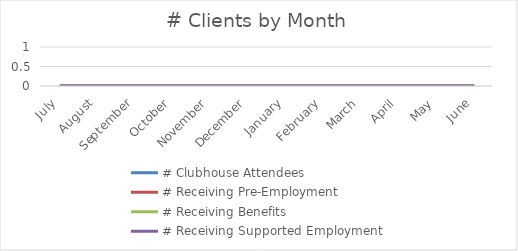
| Category | # Clubhouse Attendees | # Receiving Pre-Employment | # Receiving Benefits | # Receiving Supported Employment |
|---|---|---|---|---|
| July | 0 | 0 | 0 | 0 |
| August | 0 | 0 | 0 | 0 |
| September | 0 | 0 | 0 | 0 |
| October | 0 | 0 | 0 | 0 |
| November | 0 | 0 | 0 | 0 |
| December | 0 | 0 | 0 | 0 |
| January | 0 | 0 | 0 | 0 |
| February | 0 | 0 | 0 | 0 |
| March | 0 | 0 | 0 | 0 |
| April | 0 | 0 | 0 | 0 |
| May | 0 | 0 | 0 | 0 |
| June | 0 | 0 | 0 | 0 |